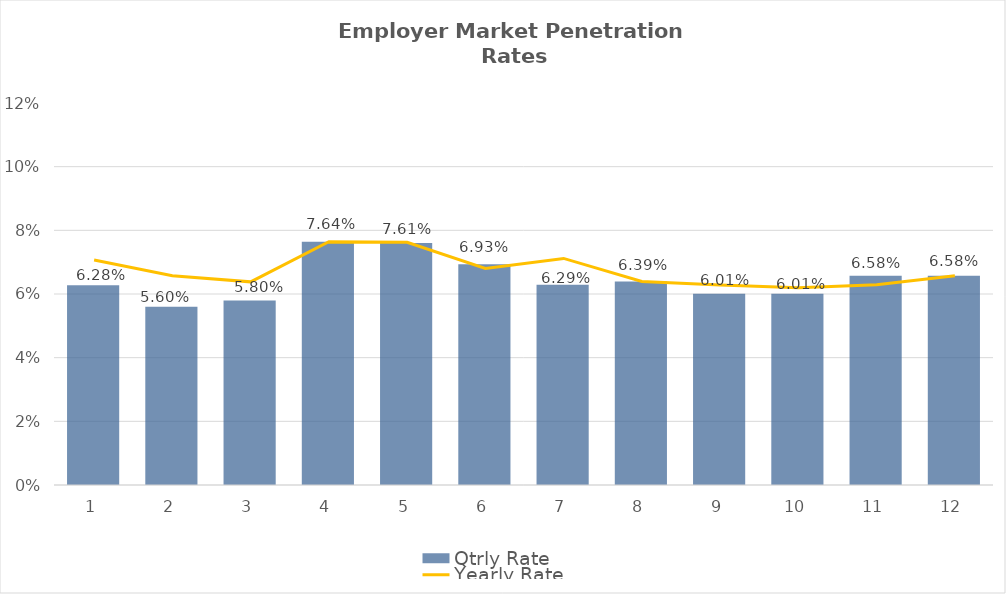
| Category | Qtrly Rate |
|---|---|
| 0 | 0.063 |
| 1 | 0.056 |
| 2 | 0.058 |
| 3 | 0.076 |
| 4 | 0.076 |
| 5 | 0.069 |
| 6 | 0.063 |
| 7 | 0.064 |
| 8 | 0.06 |
| 9 | 0.06 |
| 10 | 0.066 |
| 11 | 0.066 |